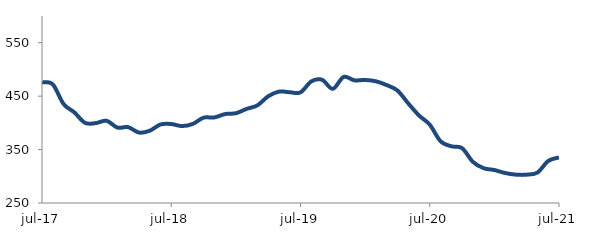
| Category | Series 0 |
|---|---|
| 2017-07-01 | 475.773 |
| 2017-08-01 | 472.095 |
| 2017-09-01 | 435.36 |
| 2017-10-01 | 419.613 |
| 2017-11-01 | 399.993 |
| 2017-12-01 | 399.593 |
| 2018-01-01 | 403.819 |
| 2018-02-01 | 391.148 |
| 2018-03-01 | 391.982 |
| 2018-04-01 | 381.858 |
| 2018-05-01 | 385.253 |
| 2018-06-01 | 396.938 |
| 2018-07-01 | 397.791 |
| 2018-08-01 | 393.946 |
| 2018-09-01 | 397.991 |
| 2018-10-01 | 409.681 |
| 2018-11-01 | 410.109 |
| 2018-12-01 | 416.457 |
| 2019-01-01 | 418.023 |
| 2019-02-01 | 426.141 |
| 2019-03-01 | 432.718 |
| 2019-04-01 | 449.714 |
| 2019-05-01 | 458.458 |
| 2019-06-01 | 457.312 |
| 2019-07-01 | 457.058 |
| 2019-08-01 | 477.544 |
| 2019-09-01 | 480.652 |
| 2019-10-01 | 463.67 |
| 2019-11-01 | 485.887 |
| 2019-12-01 | 479.593 |
| 2020-01-01 | 480.293 |
| 2020-02-01 | 477.774 |
| 2020-03-01 | 470.708 |
| 2020-04-01 | 460.537 |
| 2020-05-01 | 436.562 |
| 2020-06-01 | 413.857 |
| 2020-07-01 | 396.652 |
| 2020-08-01 | 365.687 |
| 2020-09-01 | 356.18 |
| 2020-10-01 | 352.658 |
| 2020-11-01 | 327.164 |
| 2020-12-01 | 315.173 |
| 2021-01-01 | 311.708 |
| 2021-02-01 | 306.103 |
| 2021-03-01 | 303.075 |
| 2021-04-01 | 303.034 |
| 2021-05-01 | 306.996 |
| 2021-06-01 | 328.614 |
| 2021-07-01 | 335.232 |